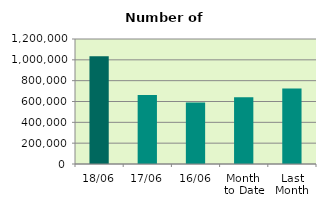
| Category | Series 0 |
|---|---|
| 18/06 | 1034342 |
| 17/06 | 663154 |
| 16/06 | 590228 |
| Month 
to Date | 640368.714 |
| Last
Month | 723791.905 |